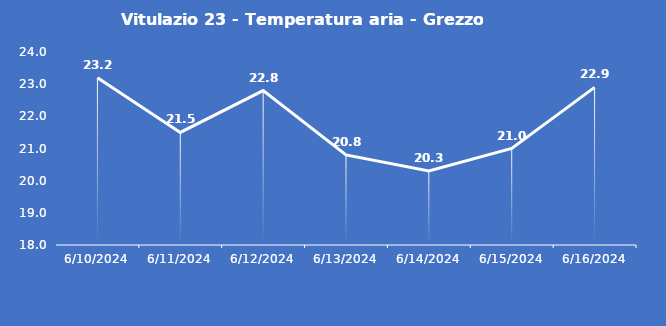
| Category | Vitulazio 23 - Temperatura aria - Grezzo (°C) |
|---|---|
| 6/10/24 | 23.2 |
| 6/11/24 | 21.5 |
| 6/12/24 | 22.8 |
| 6/13/24 | 20.8 |
| 6/14/24 | 20.3 |
| 6/15/24 | 21 |
| 6/16/24 | 22.9 |